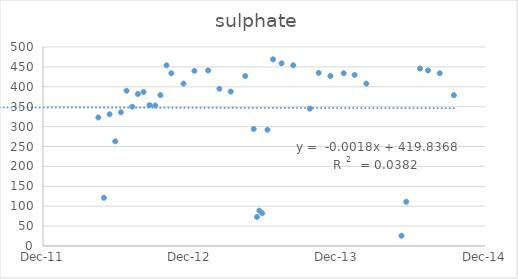
| Category | Series 0 |
|---|---|
| 41017.0 | 323 |
| 41031.0 | 121 |
| 41045.0 | 331 |
| 41059.0 | 263 |
| 41073.0 | 336 |
| 41087.0 | 390 |
| 41101.0 | 350 |
| 41115.0 | 382 |
| 41129.0 | 387 |
| 41144.0 | 354 |
| 41158.0 | 353 |
| 41171.0 | 379 |
| 41186.0 | 454 |
| 41198.0 | 434 |
| 41228.0 | 408 |
| 41255.0 | 440 |
| 41289.0 | 441 |
| 41317.0 | 395 |
| 41345.0 | 388 |
| 41381.0 | 427 |
| 41402.0 | 294 |
| 41410.0 | 73 |
| 41416.0 | 88.9 |
| 41423.0 | 82.4 |
| 41436.0 | 292 |
| 41450.0 | 469 |
| 41471.0 | 459 |
| 41500.0 | 454 |
| 41541.0 | 345 |
| 41563.0 | 435 |
| 41592.0 | 427 |
| 41625.0 | 434 |
| 41652.0 | 430 |
| 41681.0 | 408 |
| 41768.0 | 25.7 |
| 41780.0 | 111 |
| 41814.0 | 446 |
| 41834.0 | 441 |
| 41863.0 | 434 |
| 41898.0 | 379 |